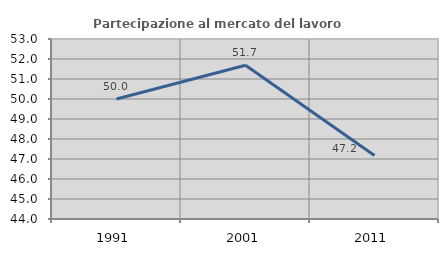
| Category | Partecipazione al mercato del lavoro  femminile |
|---|---|
| 1991.0 | 50 |
| 2001.0 | 51.685 |
| 2011.0 | 47.17 |